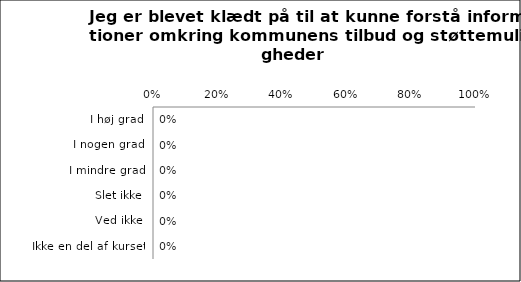
| Category | Jeg er blevet klædt på til at kunne forstå information om kommunens tilbud og støttemuligheder |
|---|---|
| I høj grad | 0 |
| I nogen grad | 0 |
| I mindre grad | 0 |
| Slet ikke | 0 |
| Ved ikke | 0 |
| Ikke en del af kurset | 0 |